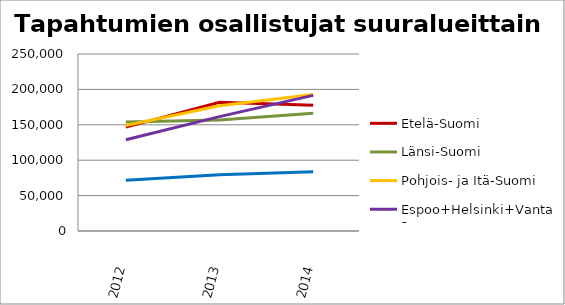
| Category | Etelä-Suomi | Länsi-Suomi | Pohjois- ja Itä-Suomi | Espoo+Helsinki+Vantaa | Muu Uusimaa |
|---|---|---|---|---|---|
| 2012.0 | 146708 | 153875 | 149006 | 128820 | 71768 |
| 2013.0 | 181736 | 156861 | 176802 | 161523 | 79406 |
| 2014.0 | 177518 | 166202 | 192636 | 191555 | 83815 |